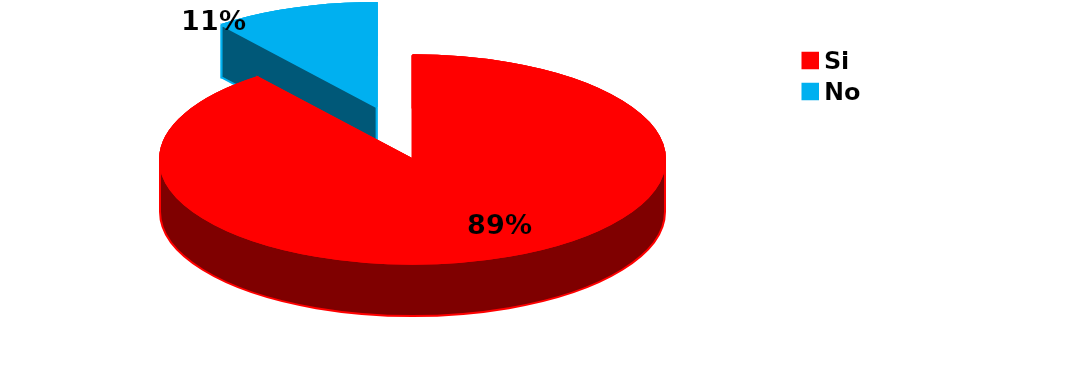
| Category | Series 0 |
|---|---|
| Si | 17 |
| No | 2 |